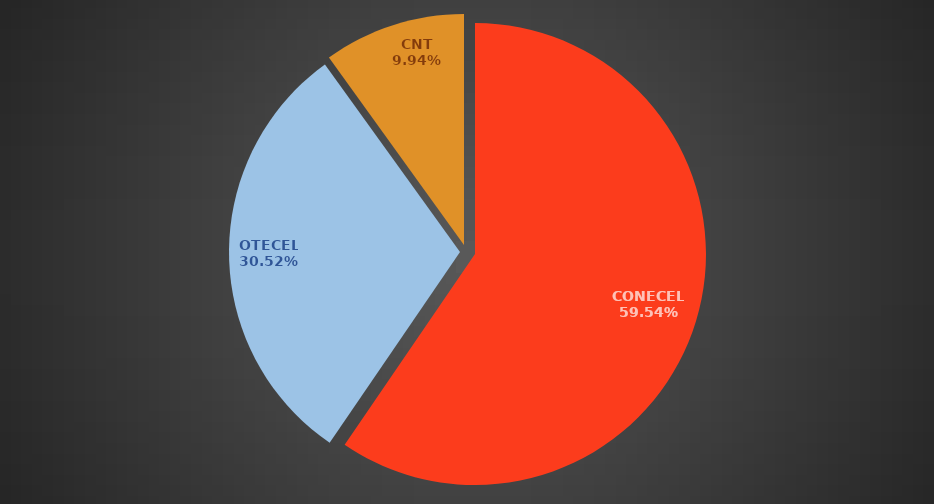
| Category | Sep2016 |
|---|---|
| CONECEL | 8777976 |
| OTECEL | 4499011 |
| CNT | 1465436 |